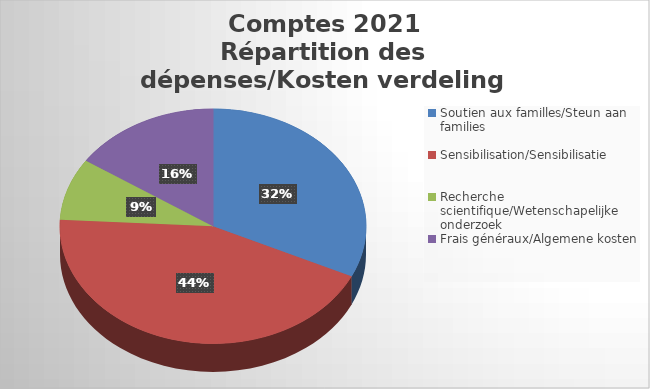
| Category | Series 0 |
|---|---|
| Soutien aux familles/Steun aan families | 1392357.81 |
| Sensibilisation/Sensibilisatie | 1905797.2 |
| Recherche scientifique/Wetenschapelijke onderzoek | 371205.96 |
| Frais généraux/Algemene kosten | 677401.14 |